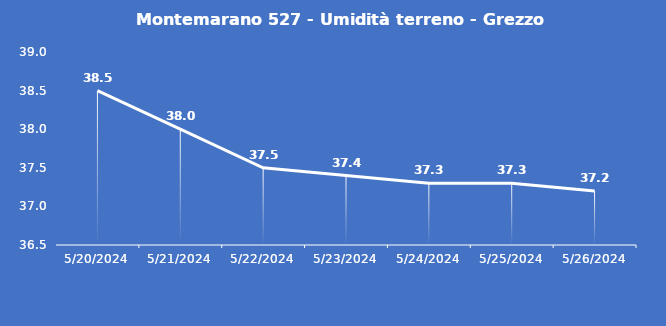
| Category | Montemarano 527 - Umidità terreno - Grezzo (%VWC) |
|---|---|
| 5/20/24 | 38.5 |
| 5/21/24 | 38 |
| 5/22/24 | 37.5 |
| 5/23/24 | 37.4 |
| 5/24/24 | 37.3 |
| 5/25/24 | 37.3 |
| 5/26/24 | 37.2 |